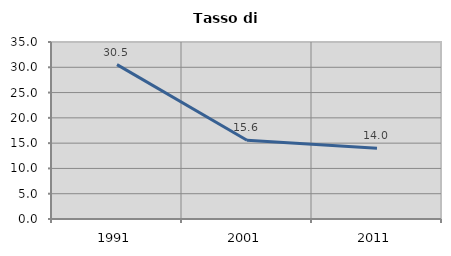
| Category | Tasso di disoccupazione   |
|---|---|
| 1991.0 | 30.533 |
| 2001.0 | 15.585 |
| 2011.0 | 14.001 |